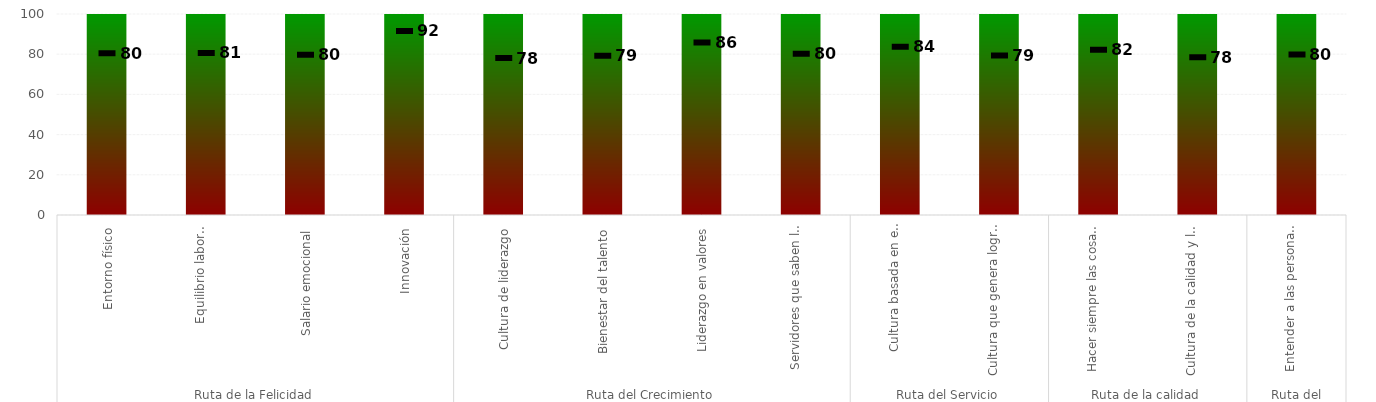
| Category | Niveles |
|---|---|
| 0 | 100 |
| 1 | 100 |
| 2 | 100 |
| 3 | 100 |
| 4 | 100 |
| 5 | 100 |
| 6 | 100 |
| 7 | 100 |
| 8 | 100 |
| 9 | 100 |
| 10 | 100 |
| 11 | 100 |
| 12 | 100 |